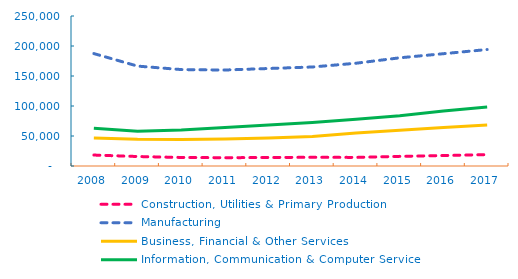
| Category | Construction, Utilities & Primary Production  | Manufacturing  | Business, Financial & Other Services | Information, Communication & Computer Services |
|---|---|---|---|---|
| 2008.0 | 18249 | 187373 | 46742 | 63106 |
| 2009.0 | 15797 | 166497 | 44517 | 58007 |
| 2010.0 | 14266 | 160722 | 44027 | 60087 |
| 2011.0 | 13809 | 159972 | 45041 | 64363 |
| 2012.0 | 14202 | 162506 | 46740 | 68523 |
| 2013.0 | 14524 | 165011 | 49237 | 72700 |
| 2014.0 | 14336 | 171276 | 54883 | 77762 |
| 2015.0 | 16059 | 180334 | 59636 | 83603 |
| 2016.0 | 17428 | 187169 | 64224 | 91620 |
| 2017.0 | 18954 | 194138 | 68443 | 98275 |